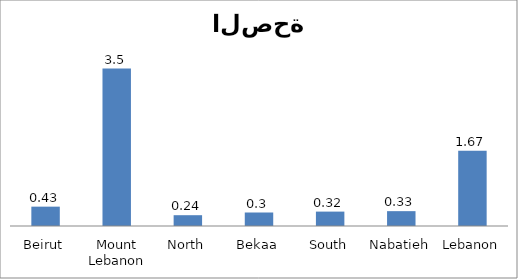
| Category | 06 |
|---|---|
| Beirut | 0.43 |
| Mount Lebanon | 3.5 |
| North | 0.24 |
| Bekaa | 0.3 |
| South | 0.32 |
| Nabatieh | 0.33 |
| Lebanon | 1.67 |